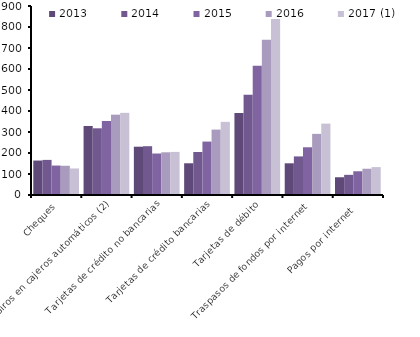
| Category | 2013 | 2014 | 2015 | 2016 | 2017 (1) |
|---|---|---|---|---|---|
| Cheques | 164.019 | 167.149 | 140.223 | 139.18 | 126.368 |
| Giros en cajeros automáticos (2) | 328.603 | 317.665 | 352.512 | 382.524 | 391.201 |
| Tarjetas de crédito no bancarias | 230.001 | 232.395 | 197.546 | 203.324 | 205.174 |
| Tarjetas de crédito bancarias | 151.092 | 204.893 | 254.416 | 311.405 | 348.283 |
| Tarjetas de débito | 390.579 | 476.95 | 615.469 | 739.68 | 838.017 |
| Traspasos de fondos por internet  | 150.953 | 183.719 | 227.306 | 291.087 | 339.89 |
| Pagos por internet  | 84.525 | 96.03 | 112.998 | 125.044 | 132.808 |